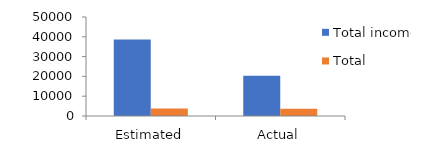
| Category | Total income | Total Expenses |
|---|---|---|
| Estimated | 38650 | 3750 |
| Actual | 20310 | 3617 |